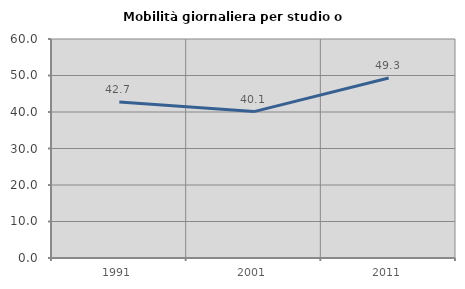
| Category | Mobilità giornaliera per studio o lavoro |
|---|---|
| 1991.0 | 42.748 |
| 2001.0 | 40.106 |
| 2011.0 | 49.309 |